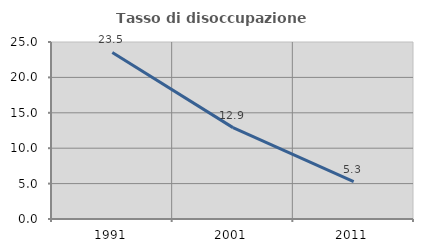
| Category | Tasso di disoccupazione giovanile  |
|---|---|
| 1991.0 | 23.529 |
| 2001.0 | 12.903 |
| 2011.0 | 5.263 |